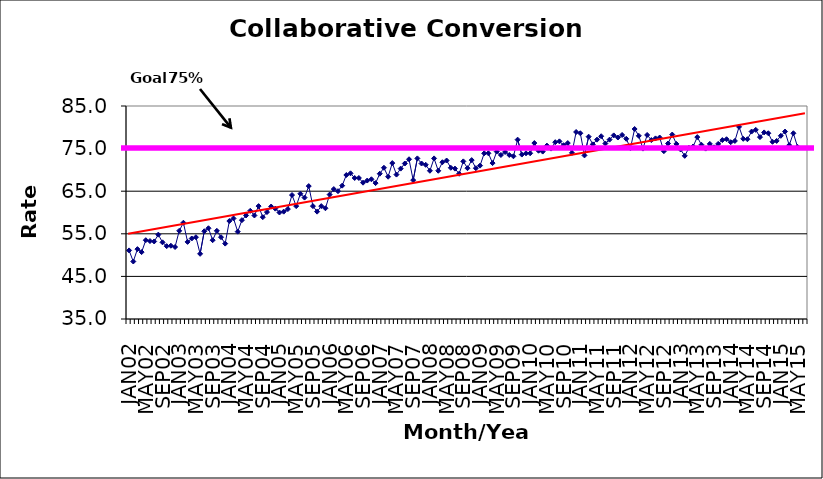
| Category | Series 0 |
|---|---|
| JAN02 | 51.1 |
| FEB02 | 48.5 |
| MAR02 | 51.4 |
| APR02 | 50.7 |
| MAY02 | 53.5 |
| JUN02 | 53.3 |
| JUL02 | 53.2 |
| AUG02 | 54.8 |
| SEP02 | 53 |
| OCT02 | 52.1 |
| NOV02 | 52.2 |
| DEC02 | 51.9 |
| JAN03 | 55.7 |
| FEB03 | 57.6 |
| MAR03 | 53.1 |
| APR03 | 53.9 |
| MAY03 | 54.2 |
| JUN03 | 50.3 |
| JUL03 | 55.6 |
| AUG03 | 56.3 |
| SEP03 | 53.5 |
| OCT03 | 55.7 |
| NOV03 | 54.2 |
| DEC03 | 52.7 |
| JAN04 | 58 |
| FEB04 | 58.6 |
| MAR04 | 55.5 |
| APR04 | 58.2 |
| MAY04 | 59.3 |
| JUN04 | 60.4 |
| JUL04 | 59.3 |
| AUG04 | 61.5 |
| SEP04 | 58.9 |
| OCT04 | 60.1 |
| NOV04 | 61.4 |
| DEC04 | 60.9 |
| JAN05 | 60 |
| FEB05 | 60.2 |
| MAR05 | 60.8 |
| APR05 | 64.1 |
| MAY05 | 61.5 |
| JUN05 | 64.4 |
| JUL05 | 63.5 |
| AUG05 | 66.2 |
| SEP05 | 61.5 |
| OCT05 | 60.2 |
| NOV05 | 61.5 |
| DEC05 | 61 |
| JAN06 | 64.2 |
| FEB06 | 65.5 |
| MAR06 | 65 |
| APR06 | 66.3 |
| MAY06 | 68.8 |
| JUN06 | 69.2 |
| JUL06 | 68.1 |
| AUG06 | 68.1 |
| SEP06 | 67 |
| OCT06 | 67.5 |
| NOV06 | 67.8 |
| DEC06 | 66.9 |
| JAN07 | 69.1 |
| FEB07 | 70.5 |
| MAR07 | 68.4 |
| APR07 | 71.6 |
| MAY07 | 68.9 |
| JUN07 | 70.3 |
| JUL07 | 71.5 |
| AUG07 | 72.5 |
| SEP07 | 67.6 |
| OCT07 | 72.7 |
| NOV07 | 71.5 |
| DEC07 | 71.2 |
| JAN08 | 69.8 |
| FEB08 | 72.7 |
| MAR08 | 69.8 |
| APR08 | 71.8 |
| MAY08 | 72.2 |
| JUN08 | 70.5 |
| JUL08 | 70.3 |
| AUG08 | 69.1 |
| SEP08 | 72 |
| OCT08 | 70.4 |
| NOV08 | 72.3 |
| DEC08 | 70.4 |
| JAN09 | 71 |
| FEB09 | 73.9 |
| MAR09 | 73.9 |
| APR09 | 71.6 |
| MAY09 | 74.3 |
| JUN09 | 73.5 |
| JUL09 | 74.2 |
| AUG09 | 73.5 |
| SEP09 | 73.2 |
| OCT09 | 77.1 |
| NOV09 | 73.6 |
| DEC09 | 73.9 |
| JAN10 | 73.9 |
| FEB10 | 76.3 |
| MAR10 | 74.5 |
| APR10 | 74.3 |
| MAY10 | 75.7 |
| JUN10 | 75 |
| JUL10 | 76.5 |
| AUG10 | 76.7 |
| SEP10 | 75.8 |
| OCT10 | 76.3 |
| NOV10 | 74 |
| DEC10 | 78.9 |
| JAN11 | 78.6 |
| FEB11 | 73.4 |
| MAR11 | 77.8 |
| APR11 | 76 |
| MAY11 | 77.1 |
| JUN11 | 77.9 |
| JUL11 | 76.2 |
| AUG11 | 77.1 |
| SEP11 | 78.1 |
| OCT11 | 77.6 |
| NOV11 | 78.2 |
| DEC11 | 77.3 |
| JAN12 | 75.1 |
| FEB12 | 79.6 |
| MAR12 | 78 |
| APR12 | 75 |
| MAY12 | 78.2 |
| JUN12 | 77 |
| JUL12 | 77.4 |
| AUG12 | 77.6 |
| SEP12 | 74.4 |
| OCT12 | 76.2 |
| NOV12 | 78.3 |
| DEC12 | 76.1 |
| JAN13 | 74.8 |
| FEB13 | 73.3 |
| MAR13 | 75.2 |
| APR13 | 75.5 |
| MAY13 | 77.7 |
| JUN13 | 75.9 |
| JUL13 | 75 |
| AUG13 | 76.1 |
| SEP13 | 75.3 |
| OCT13 | 76.1 |
| NOV13 | 77 |
| DEC13 | 77.2 |
| JAN14 | 76.5 |
| FEB14 | 76.8 |
| MAR14 | 80.1 |
| APR14 | 77.3 |
| MAY14 | 77.2 |
| JUN14 | 79 |
| JUL14 | 79.4 |
| AUG14 | 77.7 |
| SEP14 | 78.8 |
| OCT14 | 78.6 |
| NOV14 | 76.6 |
| DEC14 | 76.8 |
| JAN15 | 78 |
| FEB15 | 79 |
| MAR15 | 75.8 |
| APR15 | 78.6 |
| MAY15 | 75.4 |